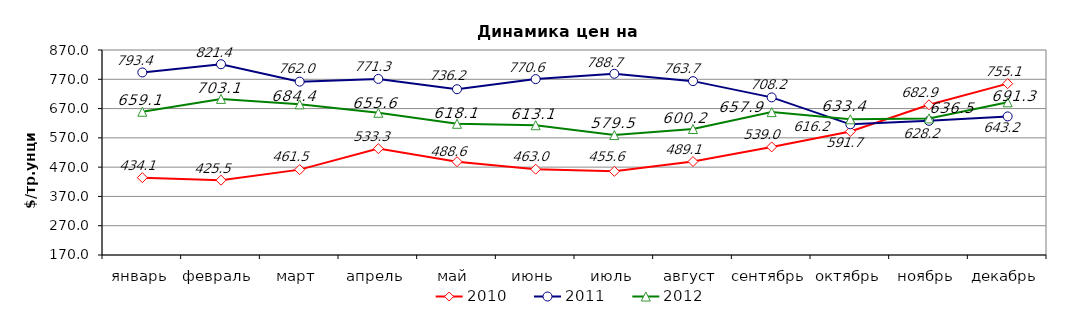
| Category | 2010 | 2011 | 2012 |
|---|---|---|---|
| январь | 434.1 | 793.35 | 659.14 |
| февраль | 425.5 | 821.35 | 703.05 |
| март | 461.5 | 762 | 684.36 |
| апрель | 533.25 | 771.31 | 655.58 |
| май | 488.58 | 736.15 | 618.05 |
| июнь | 463 | 770.57 | 613.11 |
| июль | 455.61 | 788.74 | 579.5 |
| август | 489.12 | 763.7 | 600.2 |
| сентябрь | 539.02 | 708.17 | 657.9 |
| октябрь | 591.71 | 616.219 | 633.37 |
| ноябрь | 682.91 | 628.23 | 636.5 |
| декабрь | 755.12 | 643.2 | 691.32 |